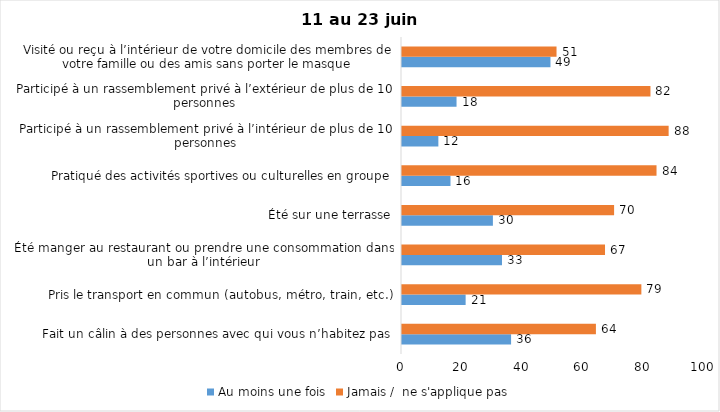
| Category | Au moins une fois | Jamais /  ne s'applique pas |
|---|---|---|
| Fait un câlin à des personnes avec qui vous n’habitez pas | 36 | 64 |
| Pris le transport en commun (autobus, métro, train, etc.) | 21 | 79 |
| Été manger au restaurant ou prendre une consommation dans un bar à l’intérieur | 33 | 67 |
| Été sur une terrasse | 30 | 70 |
| Pratiqué des activités sportives ou culturelles en groupe | 16 | 84 |
| Participé à un rassemblement privé à l’intérieur de plus de 10 personnes | 12 | 88 |
| Participé à un rassemblement privé à l’extérieur de plus de 10 personnes | 18 | 82 |
| Visité ou reçu à l’intérieur de votre domicile des membres de votre famille ou des amis sans porter le masque | 49 | 51 |